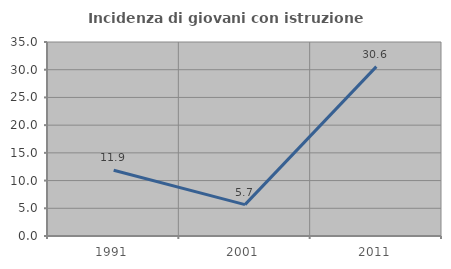
| Category | Incidenza di giovani con istruzione universitaria |
|---|---|
| 1991.0 | 11.864 |
| 2001.0 | 5.66 |
| 2011.0 | 30.556 |